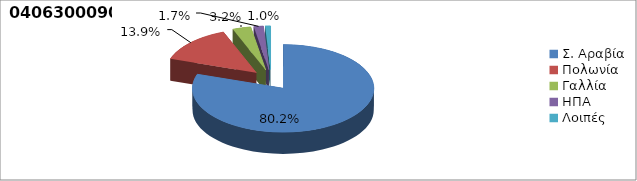
| Category | Series 0 |
|---|---|
| Σ. Αραβία | 0.802 |
| Πολωνία | 0.139 |
| Γαλλία | 0.032 |
| ΗΠΑ | 0.017 |
| Λοιπές | 0.01 |